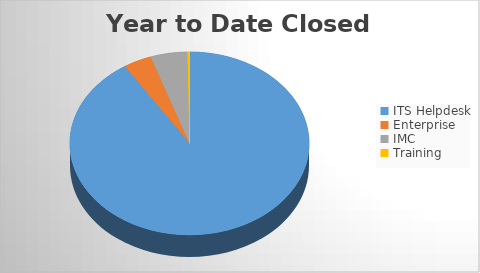
| Category | YTD Closed Tickets | 6M Opened |
|---|---|---|
| ITS Helpdesk | 3204 | 2209 |
| Enterprise | 134 | 27 |
| IMC | 176 | 103 |
| Training | 10 | 4 |